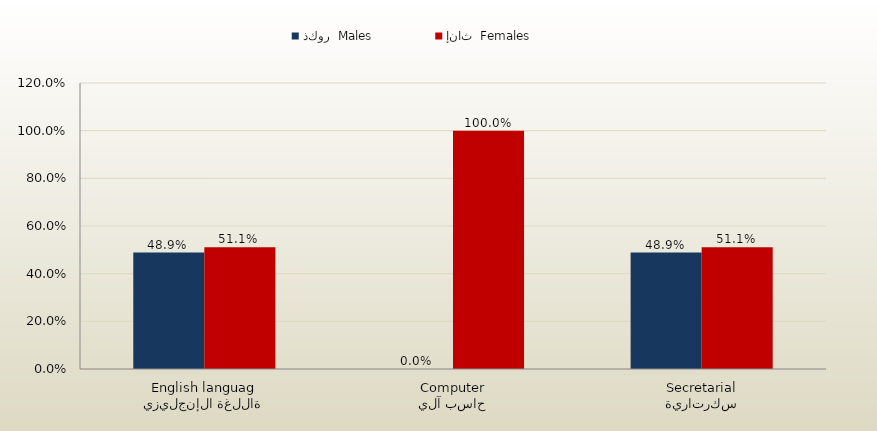
| Category | ذكور  Males | إناث  Females |
|---|---|---|
| اللغة الإنجليزية
English language | 0.489 | 0.511 |
| حاسب آلي
Computer | 0 | 1 |
| سكرتارية
Secretarial | 0.489 | 0.511 |